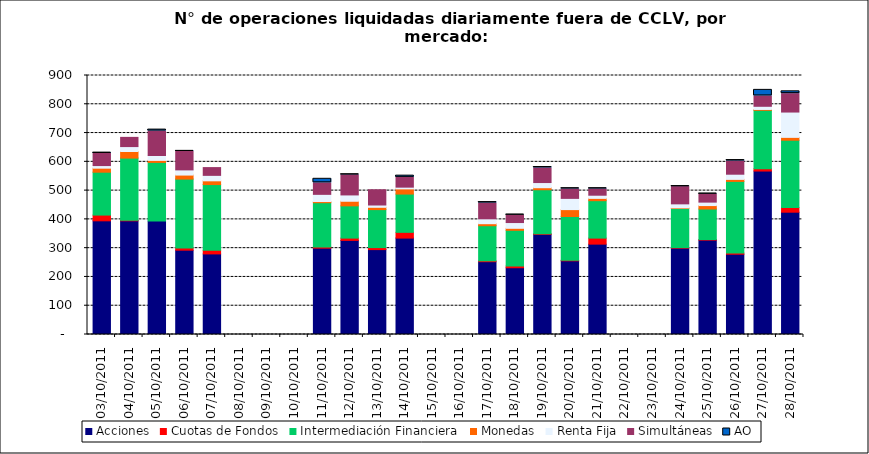
| Category | Acciones | Cuotas de Fondos | Intermediación Financiera | Monedas | Renta Fija | Simultáneas | AO |
|---|---|---|---|---|---|---|---|
| 03/10/2011 | 395 | 20 | 149 | 14 | 9 | 42 | 3 |
| 04/10/2011 | 395 | 2 | 216 | 23 | 17 | 32 | 0 |
| 05/10/2011 | 394 | 0 | 204 | 7 | 17 | 85 | 5 |
| 06/10/2011 | 293 | 8 | 239 | 14 | 18 | 64 | 2 |
| 07/10/2011 | 280 | 13 | 228 | 13 | 19 | 27 | 0 |
| 11/10/2011 | 300 | 4 | 154 | 4 | 25 | 40 | 14 |
| 12/10/2011 | 327 | 8 | 112 | 16 | 22 | 70 | 1 |
| 13/10/2011 | 295 | 7 | 132 | 8 | 8 | 53 | 0 |
| 14/10/2011 | 335 | 20 | 133 | 18 | 6 | 34 | 6 |
| 17/10/2011 | 253 | 3 | 122 | 7 | 17 | 55 | 3 |
| 18/10/2011 | 232 | 6 | 124 | 7 | 20 | 26 | 1 |
| 19/10/2011 | 348 | 2 | 153 | 7 | 18 | 51 | 3 |
| 20/10/2011 | 256 | 2 | 152 | 24 | 39 | 33 | 2 |
| 21/10/2011 | 314 | 21 | 130 | 8 | 11 | 22 | 2 |
| 24/10/2011 | 300 | 2 | 136 | 2 | 14 | 60 | 1 |
| 25/10/2011 | 328 | 2 | 106 | 12 | 12 | 28 | 1 |
| 26/10/2011 | 279 | 4 | 249 | 7 | 18 | 46 | 3 |
| 27/10/2011 | 568 | 8 | 203 | 3 | 11 | 36 | 21 |
| 28/10/2011 | 425 | 16 | 234 | 10 | 88 | 64 | 8 |